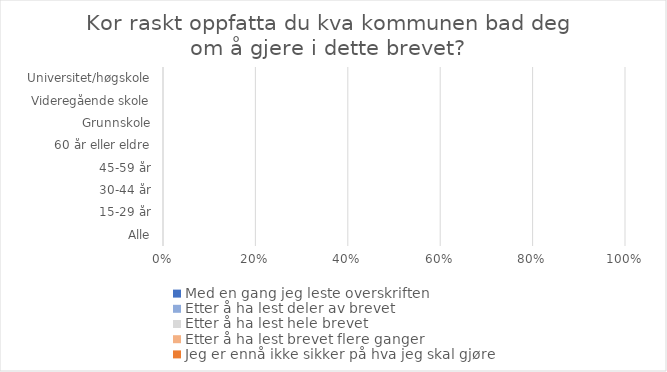
| Category | Med en gang jeg leste overskriften | Etter å ha lest deler av brevet | Etter å ha lest hele brevet | Etter å ha lest brevet flere ganger | Jeg er ennå ikke sikker på hva jeg skal gjøre |
|---|---|---|---|---|---|
| Alle | 0 | 0 | 0 | 0 | 0 |
| 15-29 år | 0 | 0 | 0 | 0 | 0 |
| 30-44 år | 0 | 0 | 0 | 0 | 0 |
| 45-59 år | 0 | 0 | 0 | 0 | 0 |
| 60 år eller eldre | 0 | 0 | 0 | 0 | 0 |
| Grunnskole | 0 | 0 | 0 | 0 | 0 |
| Videregående skole | 0 | 0 | 0 | 0 | 0 |
| Universitet/høgskole | 0 | 0 | 0 | 0 | 0 |